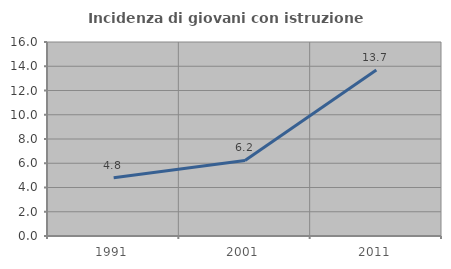
| Category | Incidenza di giovani con istruzione universitaria |
|---|---|
| 1991.0 | 4.803 |
| 2001.0 | 6.235 |
| 2011.0 | 13.694 |